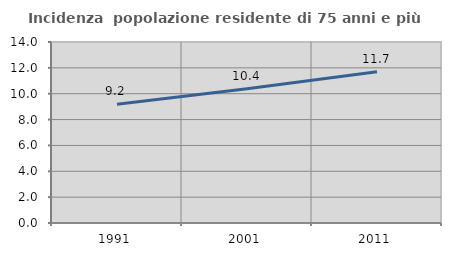
| Category | Incidenza  popolazione residente di 75 anni e più |
|---|---|
| 1991.0 | 9.193 |
| 2001.0 | 10.386 |
| 2011.0 | 11.701 |